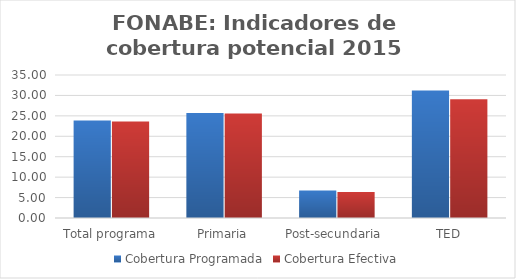
| Category | Cobertura Programada | Cobertura Efectiva |
|---|---|---|
| Total programa | 23.873 | 23.641 |
| Primaria | 25.692 | 25.599 |
| Post-secundaria  | 6.749 | 6.344 |
| TED | 31.224 | 29.061 |